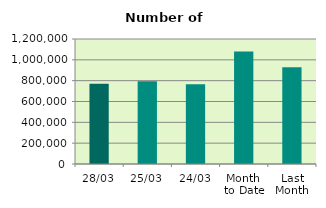
| Category | Series 0 |
|---|---|
| 28/03 | 770994 |
| 25/03 | 793632 |
| 24/03 | 765428 |
| Month 
to Date | 1080345.3 |
| Last
Month | 928647.7 |